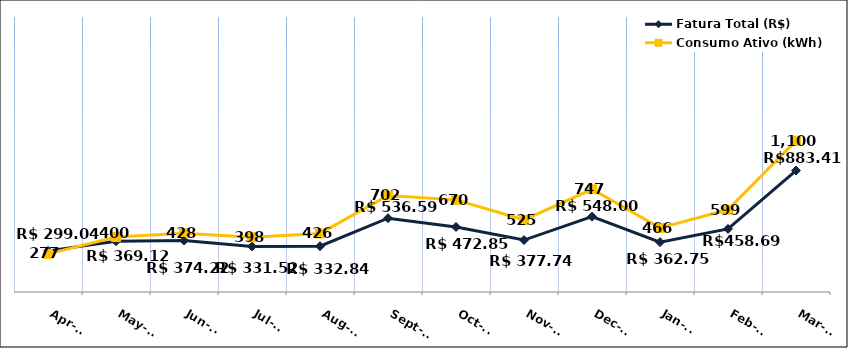
| Category | Fatura Total (R$) |
|---|---|
| 2022-04-01 | 299.04 |
| 2022-05-01 | 369.12 |
| 2022-06-01 | 374.22 |
| 2022-07-01 | 331.52 |
| 2022-08-01 | 332.84 |
| 2022-09-01 | 536.59 |
| 2022-10-01 | 472.85 |
| 2022-11-01 | 377.74 |
| 2022-12-01 | 548 |
| 2023-01-01 | 362.75 |
| 2023-02-01 | 458.69 |
| 2023-03-01 | 883.41 |